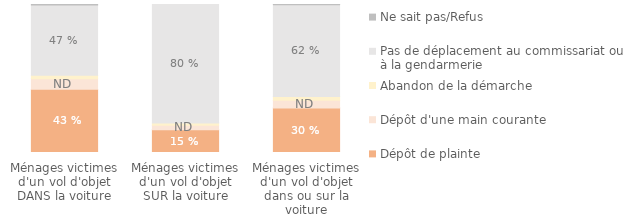
| Category | Dépôt de plainte | Dépôt d'une main courante | Abandon de la démarche | Pas de déplacement au commissariat ou à la gendarmerie | Ne sait pas/Refus |
|---|---|---|---|---|---|
| Ménages victimes d'un vol d'objet dans ou sur la voiture | 0.301 | 0.053 | 0.025 | 0.62 | 0.002 |
| Ménages victimes d'un vol d'objet SUR la voiture | 0.154 | 0.03 | 0.015 | 0.801 | 0 |
| Ménages victimes d'un vol d'objet DANS la voiture | 0.427 | 0.071 | 0.025 | 0.474 | 0.004 |